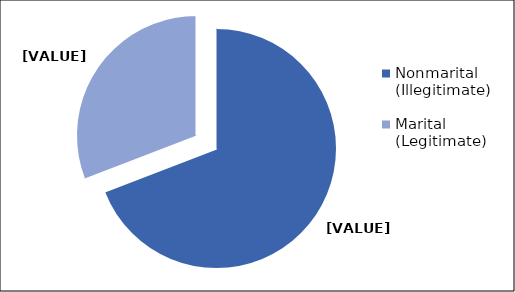
| Category | Series 0 |
|---|---|
| Nonmarital (Illegitimate) | 69.151 |
| Marital (Legitimate) | 30.849 |